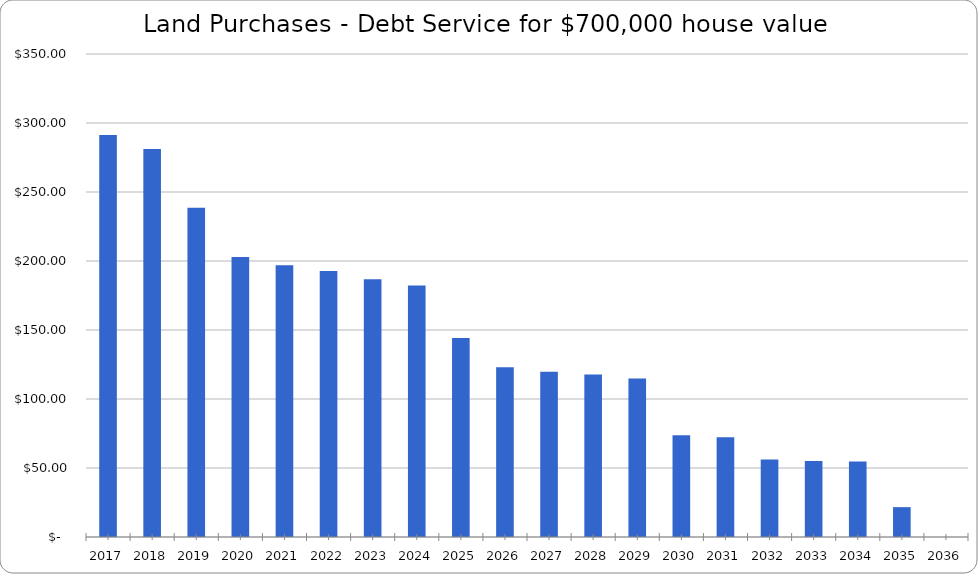
| Category | Series 0 |
|---|---|
| 2017.0 | 291.28 |
| 2018.0 | 281.214 |
| 2019.0 | 238.587 |
| 2020.0 | 202.88 |
| 2021.0 | 196.881 |
| 2022.0 | 192.695 |
| 2023.0 | 186.74 |
| 2024.0 | 182.294 |
| 2025.0 | 144.223 |
| 2026.0 | 123.062 |
| 2027.0 | 119.664 |
| 2028.0 | 117.697 |
| 2029.0 | 114.808 |
| 2030.0 | 73.751 |
| 2031.0 | 72.235 |
| 2032.0 | 56.157 |
| 2033.0 | 55.108 |
| 2034.0 | 54.789 |
| 2035.0 | 21.637 |
| 2036.0 | 0 |